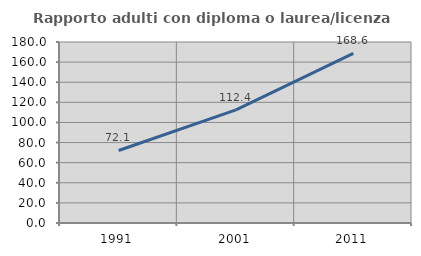
| Category | Rapporto adulti con diploma o laurea/licenza media  |
|---|---|
| 1991.0 | 72.135 |
| 2001.0 | 112.425 |
| 2011.0 | 168.61 |